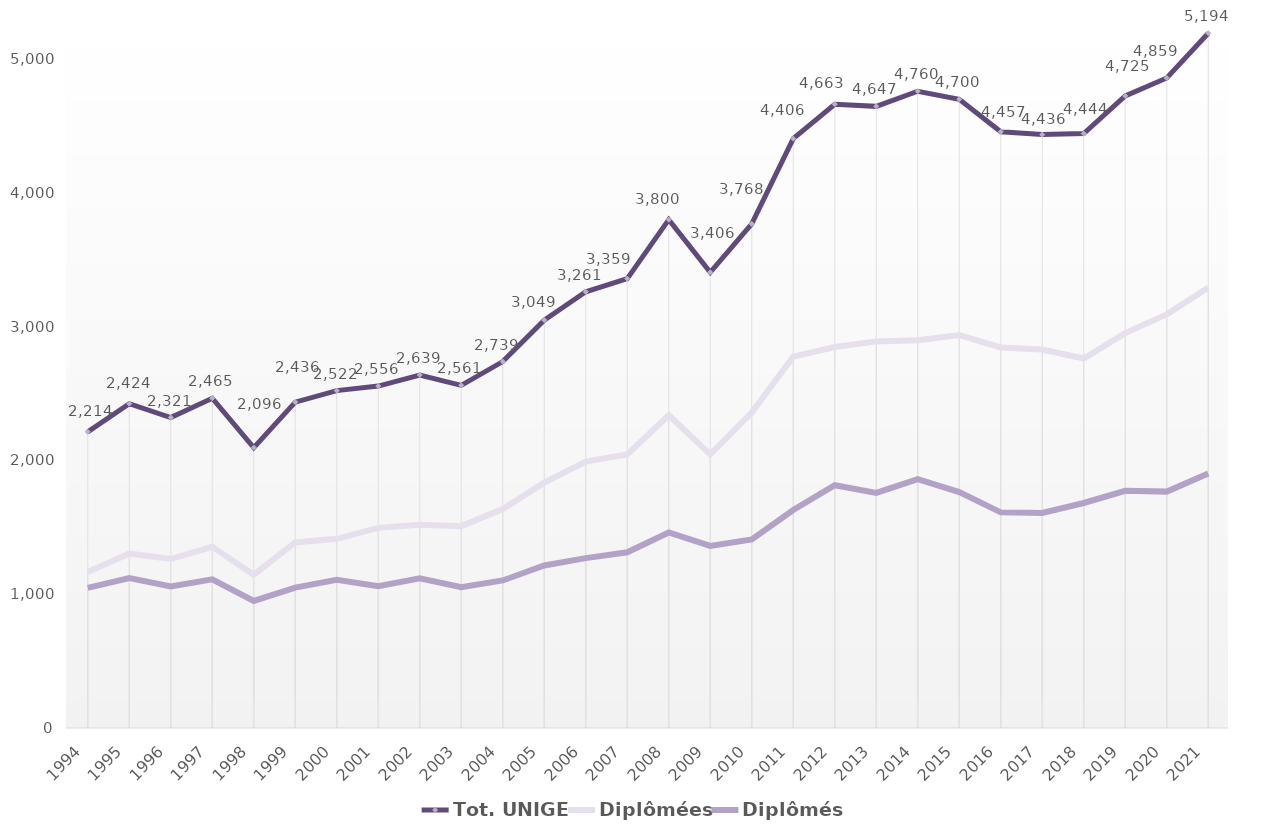
| Category | Tot. UNIGE | Diplômées | Diplômés |
|---|---|---|---|
| 1994.0 | 2214 | 1167 | 1047 |
| 1995.0 | 2424 | 1304 | 1120 |
| 1996.0 | 2321 | 1263 | 1058 |
| 1997.0 | 2465 | 1354 | 1111 |
| 1998.0 | 2096 | 1146 | 950 |
| 1999.0 | 2436 | 1387 | 1049 |
| 2000.0 | 2522 | 1414 | 1108 |
| 2001.0 | 2556 | 1496 | 1060 |
| 2002.0 | 2639 | 1520 | 1119 |
| 2003.0 | 2561 | 1509 | 1052 |
| 2004.0 | 2739 | 1636 | 1103 |
| 2005.0 | 3049 | 1834 | 1215 |
| 2006.0 | 3261 | 1991 | 1270 |
| 2007.0 | 3359 | 2045 | 1314 |
| 2008.0 | 3800 | 2338 | 1462 |
| 2009.0 | 3406 | 2045 | 1361 |
| 2010.0 | 3768 | 2358 | 1410 |
| 2011.0 | 4406 | 2776 | 1630 |
| 2012.0 | 4663 | 2848 | 1815 |
| 2013.0 | 4647 | 2890 | 1757 |
| 2014.0 | 4760 | 2899 | 1861 |
| 2015.0 | 4700 | 2937 | 1763 |
| 2016.0 | 4457 | 2845 | 1612 |
| 2017.0 | 4436 | 2829 | 1607 |
| 2018.0 | 4444 | 2762 | 1682 |
| 2019.0 | 4725 | 2952 | 1773 |
| 2020.0 | 4859 | 3092 | 1767 |
| 2021.0 | 5194 | 3292 | 1902 |